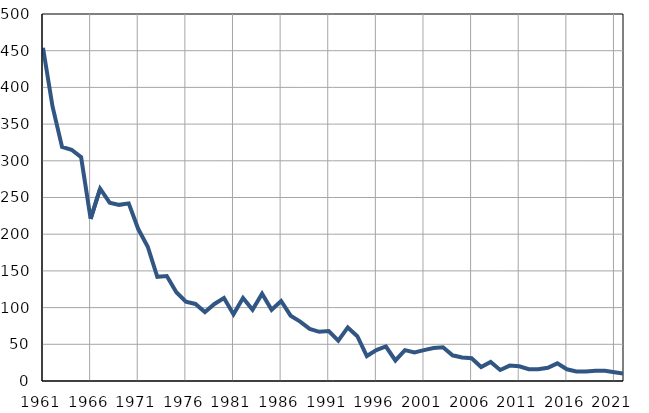
| Category | Infants
deaths |
|---|---|
| 1961.0 | 454 |
| 1962.0 | 374 |
| 1963.0 | 319 |
| 1964.0 | 315 |
| 1965.0 | 305 |
| 1966.0 | 221 |
| 1967.0 | 262 |
| 1968.0 | 243 |
| 1969.0 | 240 |
| 1970.0 | 242 |
| 1971.0 | 207 |
| 1972.0 | 183 |
| 1973.0 | 142 |
| 1974.0 | 143 |
| 1975.0 | 121 |
| 1976.0 | 108 |
| 1977.0 | 105 |
| 1978.0 | 94 |
| 1979.0 | 105 |
| 1980.0 | 113 |
| 1981.0 | 91 |
| 1982.0 | 113 |
| 1983.0 | 97 |
| 1984.0 | 119 |
| 1985.0 | 97 |
| 1986.0 | 109 |
| 1987.0 | 89 |
| 1988.0 | 81 |
| 1989.0 | 71 |
| 1990.0 | 67 |
| 1991.0 | 68 |
| 1992.0 | 55 |
| 1993.0 | 73 |
| 1994.0 | 61 |
| 1995.0 | 34 |
| 1996.0 | 42 |
| 1997.0 | 47 |
| 1998.0 | 28 |
| 1999.0 | 42 |
| 2000.0 | 39 |
| 2001.0 | 42 |
| 2002.0 | 45 |
| 2003.0 | 46 |
| 2004.0 | 35 |
| 2005.0 | 32 |
| 2006.0 | 31 |
| 2007.0 | 19 |
| 2008.0 | 26 |
| 2009.0 | 15 |
| 2010.0 | 21 |
| 2011.0 | 20 |
| 2012.0 | 16 |
| 2013.0 | 16 |
| 2014.0 | 18 |
| 2015.0 | 24 |
| 2016.0 | 16 |
| 2017.0 | 13 |
| 2018.0 | 13 |
| 2019.0 | 14 |
| 2020.0 | 14 |
| 2021.0 | 12 |
| 2022.0 | 10 |